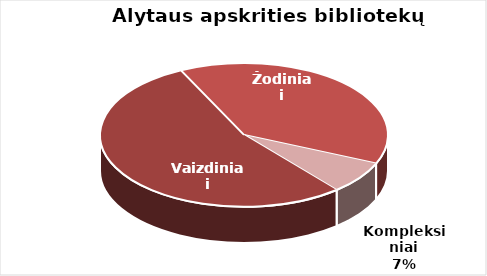
| Category | Series 0 |
|---|---|
| Vaizdiniai | 1397 |
| Žodiniai | 1004 |
| Kompleksiniai | 191 |